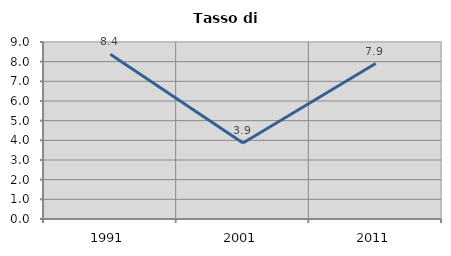
| Category | Tasso di disoccupazione   |
|---|---|
| 1991.0 | 8.382 |
| 2001.0 | 3.861 |
| 2011.0 | 7.906 |